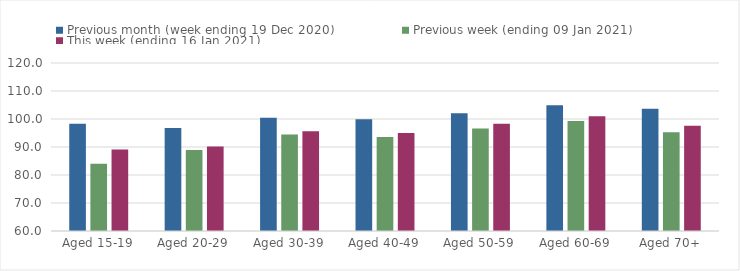
| Category | Previous month (week ending 19 Dec 2020) | Previous week (ending 09 Jan 2021) | This week (ending 16 Jan 2021) |
|---|---|---|---|
| Aged 15-19 | 98.32 | 84.02 | 89.12 |
| Aged 20-29 | 96.78 | 88.94 | 90.17 |
| Aged 30-39 | 100.45 | 94.45 | 95.64 |
| Aged 40-49 | 99.89 | 93.58 | 94.99 |
| Aged 50-59 | 102.04 | 96.63 | 98.29 |
| Aged 60-69 | 104.9 | 99.3 | 100.98 |
| Aged 70+ | 103.7 | 95.3 | 97.58 |